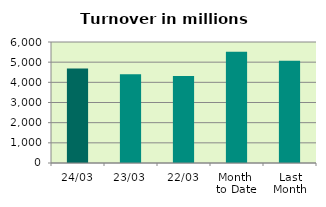
| Category | Series 0 |
|---|---|
| 24/03 | 4686.534 |
| 23/03 | 4398.411 |
| 22/03 | 4319.016 |
| Month 
to Date | 5513.946 |
| Last
Month | 5069.383 |